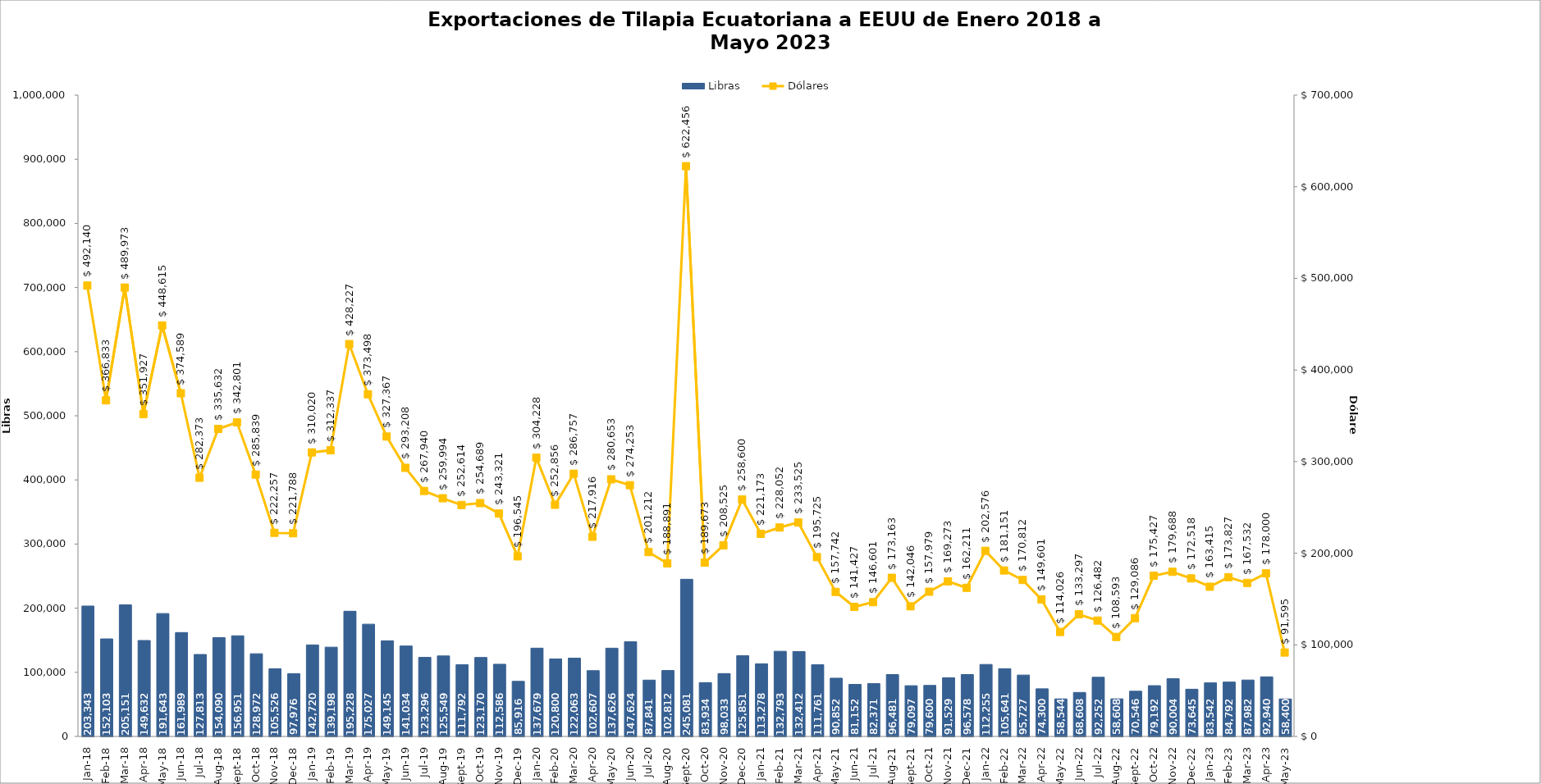
| Category | Libras  |
|---|---|
| 2018-01-01 | 203343.126 |
| 2018-02-01 | 152103.348 |
| 2018-03-01 | 205150.914 |
| 2018-04-01 | 149631.969 |
| 2018-05-01 | 191643.207 |
| 2018-06-01 | 161988.864 |
| 2018-07-01 | 127812.844 |
| 2018-08-01 | 154089.71 |
| 2018-09-01 | 156951.307 |
| 2018-10-01 | 128972.475 |
| 2018-11-01 | 105526.341 |
| 2018-12-01 | 97975.517 |
| 2019-01-01 | 142720.485 |
| 2019-02-01 | 139197.502 |
| 2019-03-01 | 195227.919 |
| 2019-04-01 | 175026.986 |
| 2019-05-01 | 149144.748 |
| 2019-06-01 | 141033.951 |
| 2019-07-01 | 123295.578 |
| 2019-08-01 | 125548.7 |
| 2019-09-01 | 111791.871 |
| 2019-10-01 | 123169.915 |
| 2019-11-01 | 112585.534 |
| 2019-12-01 | 85916.246 |
| 2020-01-01 | 137678.519 |
| 2020-02-01 | 120799.948 |
| 2020-03-01 | 122063.196 |
| 2020-04-01 | 102607.424 |
| 2020-05-01 | 137625.608 |
| 2020-06-01 | 147623.56 |
| 2020-07-01 | 87840.879 |
| 2020-08-01 | 102812.454 |
| 2020-09-01 | 245080.992 |
| 2020-10-01 | 83934.293 |
| 2020-11-01 | 98032.838 |
| 2020-12-01 | 125850.733 |
| 2021-01-01 | 113277.785 |
| 2021-02-01 | 132793.081 |
| 2021-03-01 | 132411.682 |
| 2021-04-01 | 111761.006 |
| 2021-05-01 | 90852.39 |
| 2021-06-01 | 81152.062 |
| 2021-07-01 | 82371.217 |
| 2021-08-01 | 96480.785 |
| 2021-09-01 | 79097.356 |
| 2021-10-01 | 79600.01 |
| 2021-11-01 | 91529.209 |
| 2021-12-01 | 96577.788 |
| 2022-01-01 | 112254.841 |
| 2022-02-01 | 105640.981 |
| 2022-03-01 | 95726.805 |
| 2022-04-01 | 74300.103 |
| 2022-05-01 | 58543.684 |
| 2022-06-01 | 68607.774 |
| 2022-07-01 | 92252.324 |
| 2022-08-01 | 58607.618 |
| 2022-09-01 | 70545.635 |
| 2022-10-01 | 79192.155 |
| 2022-11-01 | 90003.612 |
| 2022-12-01 | 73645.331 |
| 2023-01-01 | 83541.87 |
| 2023-02-01 | 84791.89 |
| 2023-03-01 | 87981.975 |
| 2023-04-01 | 92940.165 |
| 2023-05-01 | 58400.384 |